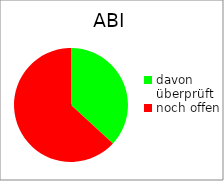
| Category | ABI |
|---|---|
| davon überprüft | 7 |
| noch offen | 12 |